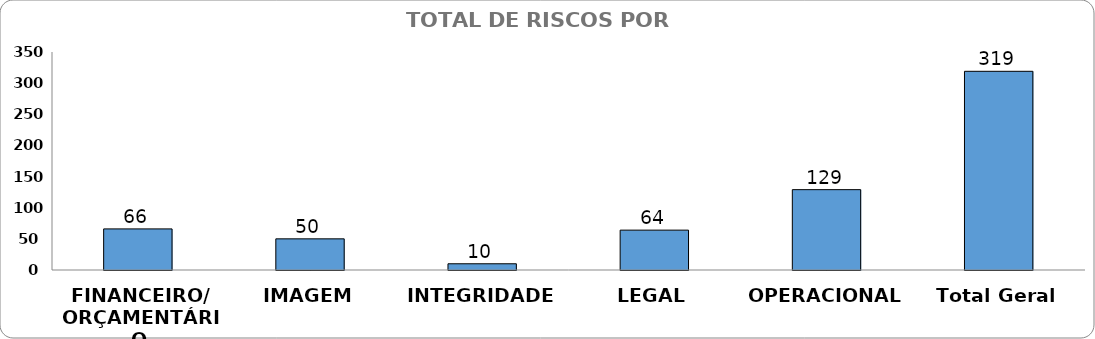
| Category | Total |
|---|---|
| FINANCEIRO/ ORÇAMENTÁRIO | 66 |
| IMAGEM | 50 |
| INTEGRIDADE | 10 |
| LEGAL | 64 |
| OPERACIONAL | 129 |
| Total Geral | 319 |